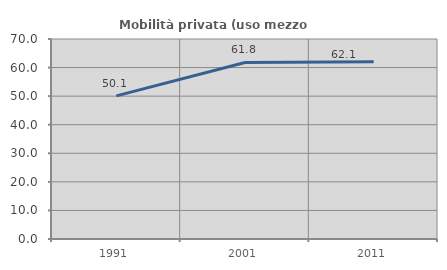
| Category | Mobilità privata (uso mezzo privato) |
|---|---|
| 1991.0 | 50.11 |
| 2001.0 | 61.798 |
| 2011.0 | 62.076 |